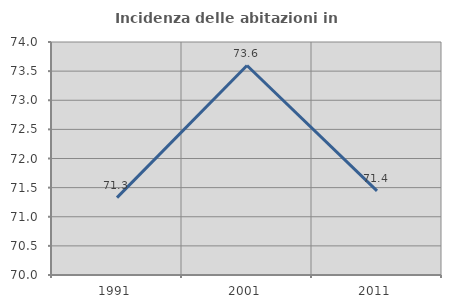
| Category | Incidenza delle abitazioni in proprietà  |
|---|---|
| 1991.0 | 71.328 |
| 2001.0 | 73.596 |
| 2011.0 | 71.445 |